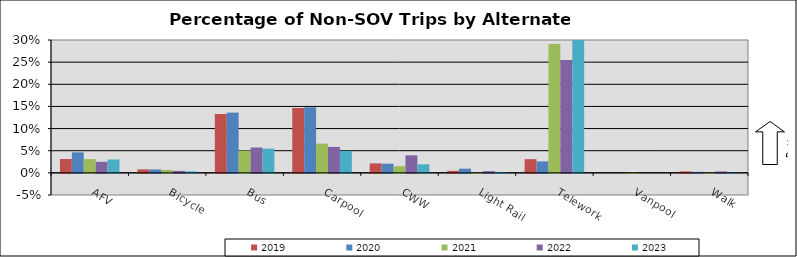
| Category | 2019 | 2020 | 2021 | 2022 | 2023 |
|---|---|---|---|---|---|
| AFV | 0.031 | 0.046 | 0.031 | 0.025 | 0.03 |
| Bicycle | 0.008 | 0.008 | 0.007 | 0.005 | 0.003 |
| Bus | 0.133 | 0.136 | 0.05 | 0.057 | 0.055 |
| Carpool | 0.147 | 0.148 | 0.066 | 0.059 | 0.05 |
| CWW | 0.021 | 0.021 | 0.015 | 0.04 | 0.019 |
| Light Rail | 0.005 | 0.009 | 0.001 | 0.004 | 0.002 |
| Telework | 0.031 | 0.026 | 0.291 | 0.255 | 0.349 |
| Vanpool | 0 | 0 | 0.001 | 0 | 0 |
| Walk | 0.003 | 0.002 | 0.001 | 0.003 | 0.001 |